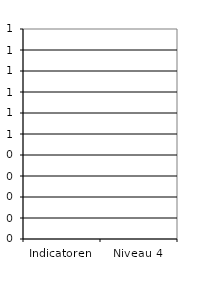
| Category | Series 0 |
|---|---|
| Indicatoren | 0 |
| Niveau 4 | 0 |